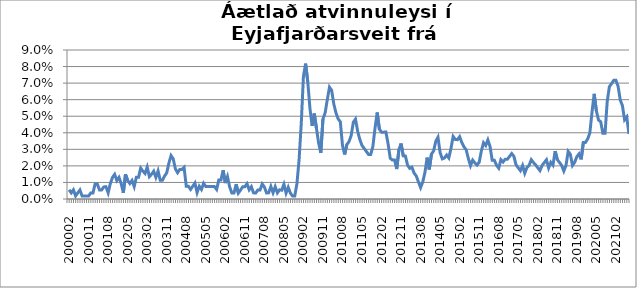
| Category | Series 0 |
|---|---|
| 200002 | 0.006 |
| 200003 | 0.004 |
| 200004 | 0.006 |
| 200005 | 0.002 |
| 200006 | 0.004 |
| 200007 | 0.005 |
| 200008 | 0.002 |
| 200009 | 0.002 |
| 200010 | 0.002 |
| 200011 | 0.002 |
| 200012 | 0.004 |
| 200101 | 0.004 |
| 200102 | 0.009 |
| 200103 | 0.009 |
| 200104 | 0.005 |
| 200105 | 0.005 |
| 200106 | 0.007 |
| 200107 | 0.007 |
| 200108 | 0.004 |
| 200109 | 0.009 |
| 200110 | 0.013 |
| 200111 | 0.015 |
| 200112 | 0.011 |
| 200201 | 0.013 |
| 200202 | 0.009 |
| 200203 | 0.004 |
| 200204 | 0.015 |
| 200205 | 0.011 |
| 200206 | 0.009 |
| 200207 | 0.011 |
| 200208 | 0.007 |
| 200209 | 0.013 |
| 200210 | 0.013 |
| 200211 | 0.019 |
| 200212 | 0.017 |
| 200301 | 0.015 |
| 200302 | 0.019 |
| 200303 | 0.013 |
| 200304 | 0.015 |
| 200305 | 0.017 |
| 200306 | 0.013 |
| 200307 | 0.017 |
| 200308 | 0.011 |
| 200309 | 0.011 |
| 200310 | 0.014 |
| 200311 | 0.016 |
| 200312 | 0.022 |
| 200401 | 0.026 |
| 200402 | 0.024 |
| 200403 | 0.018 |
| 200404 | 0.016 |
| 200405 | 0.018 |
| 200406 | 0.018 |
| 200407 | 0.019 |
| 200408 | 0.008 |
| 200409 | 0.008 |
| 200410 | 0.006 |
| 200411 | 0.008 |
| 200412 | 0.01 |
| 200501 | 0.004 |
| 200502 | 0.008 |
| 200503 | 0.006 |
| 200504 | 0.009 |
| 200505 | 0.008 |
| 200506 | 0.008 |
| 200507 | 0.007 |
| 200508 | 0.007 |
| 200509 | 0.007 |
| 200510 | 0.006 |
| 200511 | 0.012 |
| 200512 | 0.012 |
| 200601 | 0.017 |
| 200602 | 0.01 |
| 200603 | 0.013 |
| 200604 | 0.007 |
| 200605 | 0.004 |
| 200606 | 0.004 |
| 200607 | 0.009 |
| 200608 | 0.004 |
| 200609 | 0.005 |
| 200610 | 0.007 |
| 200611 | 0.007 |
| 200612 | 0.009 |
| 200701 | 0.006 |
| 200702 | 0.007 |
| 200703 | 0.004 |
| 200704 | 0.004 |
| 200705 | 0.005 |
| 200706 | 0.005 |
| 200707 | 0.009 |
| 200708 | 0.007 |
| 200709 | 0.004 |
| 200710 | 0.004 |
| 200711 | 0.008 |
| 200712 | 0.004 |
| 200801 | 0.007 |
| 200802 | 0.004 |
| 200803 | 0.006 |
| 200804 | 0.005 |
| 200805 | 0.009 |
| 200806 | 0.004 |
| 200807 | 0.007 |
| 200808 | 0.004 |
| 200809 | 0.002 |
| 200810 | 0.002 |
| 200811 | 0.009 |
| 200812 | 0.024 |
| 200901 | 0.046 |
| 200902 | 0.074 |
| 200903 | 0.082 |
| 200904 | 0.071 |
| 200905 | 0.055 |
| 200906 | 0.044 |
| 200907 | 0.052 |
| 200908 | 0.043 |
| 200909 | 0.034 |
| 200910 | 0.028 |
| 200911 | 0.048 |
| 200912 | 0.052 |
| 201001 | 0.06 |
| 201002 | 0.068 |
| 201003 | 0.066 |
| 201004 | 0.057 |
| 201005 | 0.052 |
| 201006 | 0.048 |
| 201007 | 0.047 |
| 201008 | 0.032 |
| 201009 | 0.027 |
| 201010 | 0.033 |
| 201011 | 0.035 |
| 201012 | 0.038 |
| 201101 | 0.046 |
| 201102 | 0.048 |
| 201103 | 0.041 |
| 201104 | 0.036 |
| 201105 | 0.032 |
| 201106 | 0.031 |
| 201107 | 0.029 |
| 201108 | 0.027 |
| 201109 | 0.027 |
| 201110 | 0.032 |
| 201111 | 0.043 |
| 201112 | 0.052 |
| 201201 | 0.042 |
| 201202 | 0.04 |
| 201203 | 0.04 |
| 201204 | 0.04 |
| 201205 | 0.033 |
| 201206 | 0.025 |
| 201207 | 0.024 |
| 201208 | 0.024 |
| 201209 | 0.018 |
| 201210 | 0.03 |
| 201211 | 0.034 |
| 201212 | 0.026 |
| 201301 | 0.026 |
| 201302 | 0.02 |
| 201303 | 0.019 |
| 201304 | 0.019 |
| 201305 | 0.016 |
| 201306 | 0.014 |
| 201307 | 0.01 |
| 201308 | 0.007 |
| 201309 | 0.01 |
| 201310 | 0.016 |
| 201311 | 0.025 |
| 201312 | 0.018 |
| 201401 | 0.027 |
| 201402 | 0.029 |
| 201403 | 0.035 |
| 201404 | 0.037 |
| 201405 | 0.028 |
| 201406 | 0.024 |
| 201407 | 0.025 |
| 201408 | 0.027 |
| 201409 | 0.025 |
| 201410 | 0.031 |
| 201411 | 0.038 |
| 201412 | 0.036 |
| 201501 | 0.036 |
| 201502 | 0.038 |
| 201503 | 0.034 |
| 201504 | 0.031 |
| 201505 | 0.03 |
| 201506 | 0.024 |
| 201507 | 0.02 |
| 201508 | 0.023 |
| 201509 | 0.022 |
| 201510 | 0.021 |
| 201511 | 0.022 |
| 201512 | 0.029 |
| 201601 | 0.034 |
| 201602 | 0.032 |
| 201603 | 0.036 |
| 201604 | 0.032 |
| 201605 | 0.023 |
| 201606 | 0.023 |
| 201607 | 0.02 |
| 201608 | 0.019 |
| 201609 | 0.024 |
| 201610 | 0.022 |
| 201611 | 0.024 |
| 201612 | 0.024 |
| 201701 | 0.026 |
| 201702 | 0.027 |
| 201703 | 0.026 |
| 201704 | 0.021 |
| 201705 | 0.019 |
| 201706 | 0.017 |
| 201707 | 0.02 |
| 201708 | 0.016 |
| 201709 | 0.019 |
| 201710 | 0.02 |
| 201711 | 0.024 |
| 201712 | 0.022 |
| 201801 | 0.021 |
| 201802 | 0.019 |
| 201803 | 0.017 |
| 201804 | 0.02 |
| 201805 | 0.022 |
| 201806 | 0.024 |
| 201807 | 0.019 |
| 201808 | 0.022 |
| 201809 | 0.02 |
| 201810 | 0.029 |
| 201811 | 0.024 |
| 201812 | 0.022 |
| 201901 | 0.02 |
| 201902 | 0.017 |
| 201903 | 0.02 |
| 201904 | 0.029 |
| 201905 | 0.027 |
| 201906 | 0.02 |
| 201907 | 0.022 |
| 201908 | 0.026 |
| 201909 | 0.027 |
| 201910 | 0.024 |
| 201911 | 0.034 |
| 201912 | 0.034 |
| 202001 | 0.036 |
| 202002 | 0.04 |
| 202003 | 0.053 |
| 202004 | 0.064 |
| 202005 | 0.053 |
| 202006 | 0.048 |
| 202007 | 0.047 |
| 202008 | 0.04 |
| 202009 | 0.04 |
| 202010 | 0.059 |
| 202011 | 0.068 |
| 202012 | 0.07 |
| 202101 | 0.072 |
| 202102 | 0.072 |
| 202103 | 0.068 |
| 202104 | 0.06 |
| 202105 | 0.056 |
| 202106 | 0.048 |
| 202107 | 0.05 |
| 202108 | 0.039 |